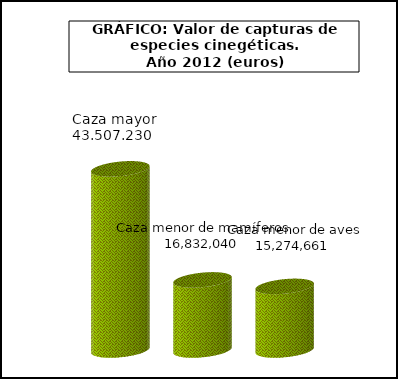
| Category | Cazar |
|---|---|
| Caza mayor | 43507230 |
| Caza menor de mamíferos | 16832040 |
| Caza menor de aves | 15274660.5 |